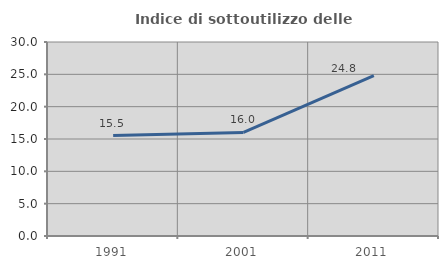
| Category | Indice di sottoutilizzo delle abitazioni  |
|---|---|
| 1991.0 | 15.531 |
| 2001.0 | 16.007 |
| 2011.0 | 24.787 |